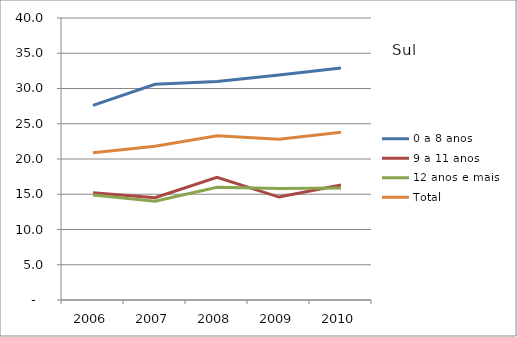
| Category | 0 a 8 anos | 9 a 11 anos | 12 anos e mais | Total |
|---|---|---|---|---|
| 2006.0 | 27.6 | 15.2 | 14.9 | 20.9 |
| 2007.0 | 30.6 | 14.5 | 14 | 21.8 |
| 2008.0 | 31 | 17.4 | 16 | 23.3 |
| 2009.0 | 31.9 | 14.6 | 15.8 | 22.8 |
| 2010.0 | 32.9 | 16.3 | 15.9 | 23.8 |